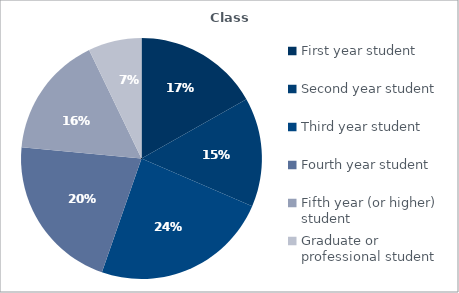
| Category | Series 0 |
|---|---|
| First year student | 0.168 |
| Second year student | 0.147 |
| Third year student | 0.239 |
| Fourth year student | 0.212 |
| Fifth year (or higher) student | 0.164 |
| Graduate or professional student | 0.072 |